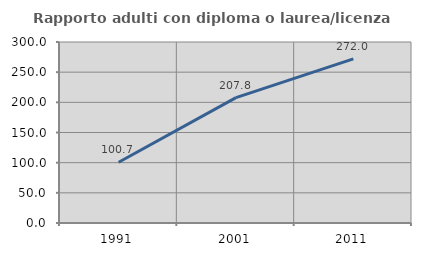
| Category | Rapporto adulti con diploma o laurea/licenza media  |
|---|---|
| 1991.0 | 100.735 |
| 2001.0 | 207.752 |
| 2011.0 | 272.034 |